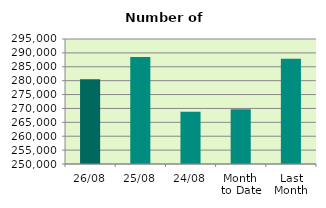
| Category | Series 0 |
|---|---|
| 26/08 | 280538 |
| 25/08 | 288488 |
| 24/08 | 268786 |
| Month 
to Date | 269743.895 |
| Last
Month | 287917.636 |